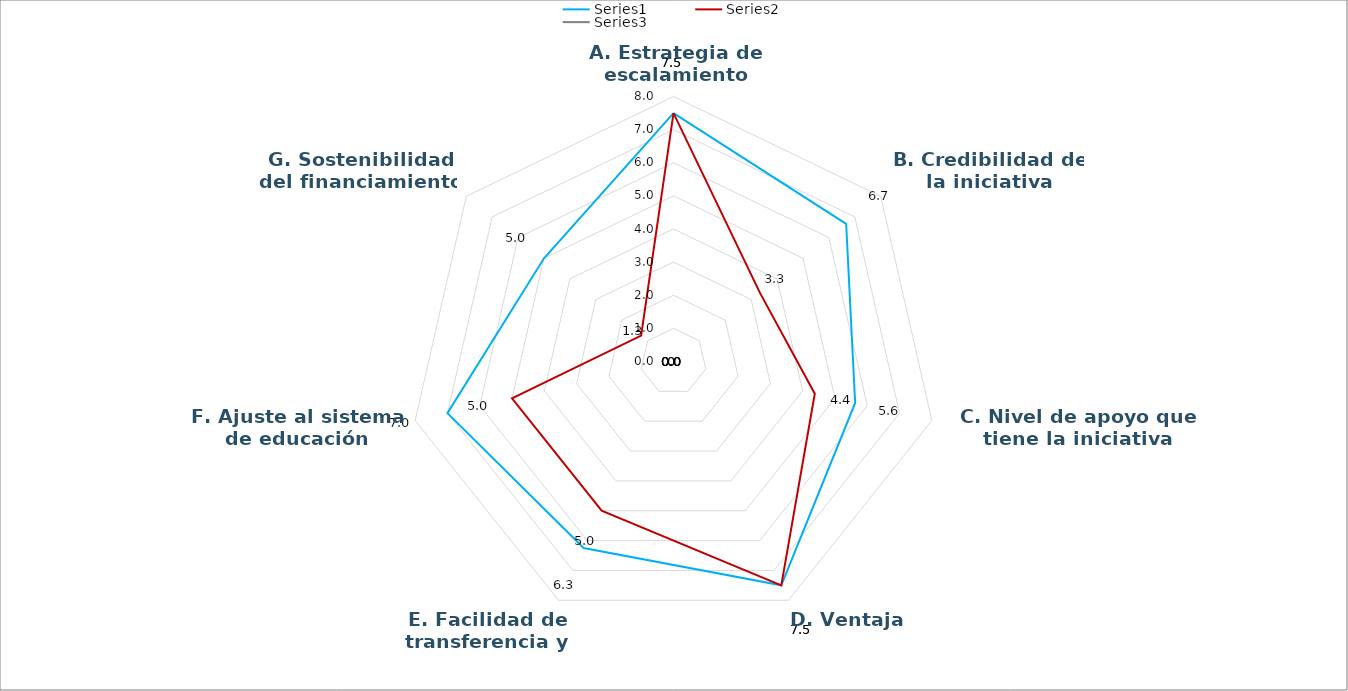
| Category | Series 0 | Series 1 | Series 2 |
|---|---|---|---|
| A. Estrategia de escalamiento convincente | 7.5 | 7.5 |  |
| B. Credibilidad de la iniciativa | 6.667 | 3.333 |  |
| C. Nivel de apoyo que tiene la iniciativa | 5.625 | 4.375 |  |
| D. Ventaja relativa | 7.5 | 7.5 |  |
| E. Facilidad de transferencia y adopción | 6.25 | 5 |  |
| F. Ajuste al sistema de educación | 7 | 5 |  |
| G. Sostenibilidad del financiamiento | 5 | 1.25 |  |